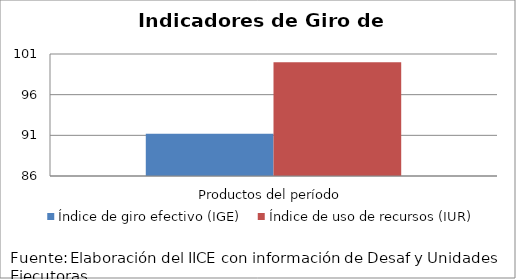
| Category | Índice de giro efectivo (IGE) | Índice de uso de recursos (IUR)  |
|---|---|---|
| Productos del período | 91.184 | 100 |